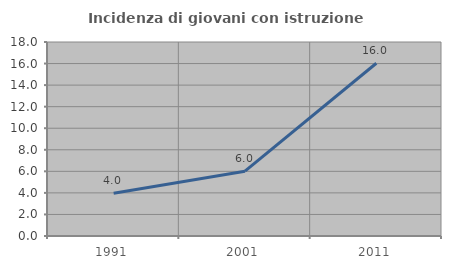
| Category | Incidenza di giovani con istruzione universitaria |
|---|---|
| 1991.0 | 3.974 |
| 2001.0 | 6.015 |
| 2011.0 | 16.031 |